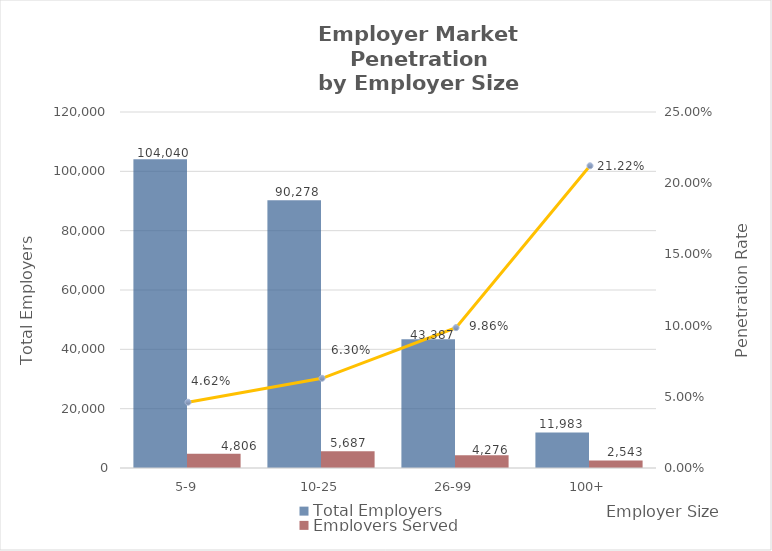
| Category | Total Employers | Employers Served |
|---|---|---|
| 5-9 | 104040 | 4806 |
| 10-25 | 90278 | 5687 |
| 26-99 | 43387 | 4276 |
| 100+ | 11983 | 2543 |